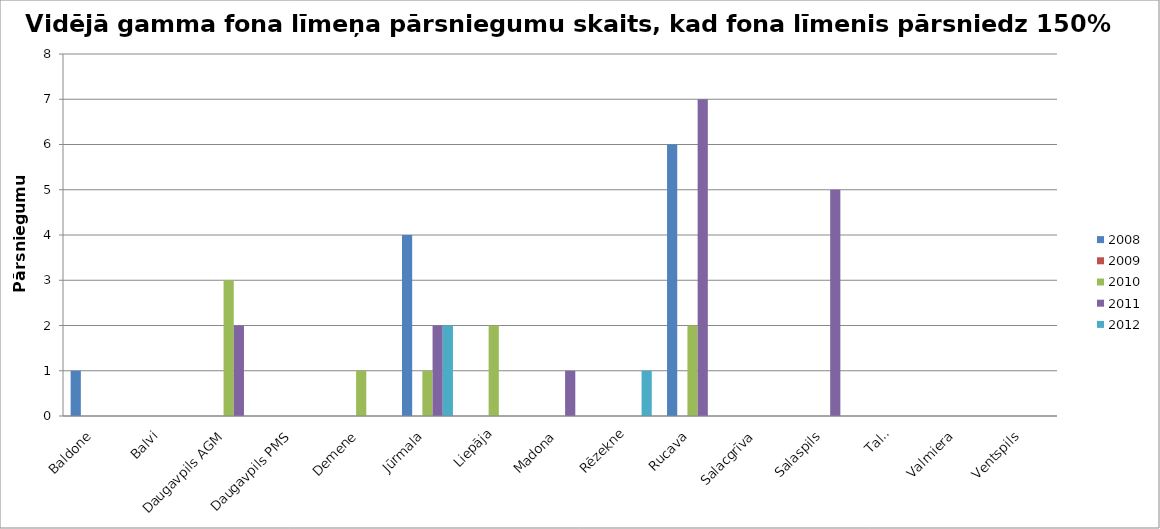
| Category | 2008 | 2009 | 2010 | 2011 | 2012 |
|---|---|---|---|---|---|
| Baldone | 1 | 0 | 0 | 0 | 0 |
| Balvi | 0 | 0 | 0 | 0 | 0 |
| Daugavpils AGM | 0 | 0 | 3 | 2 | 0 |
| Daugavpils PMS | 0 | 0 | 0 | 0 | 0 |
| Demene | 0 | 0 | 1 | 0 | 0 |
| Jūrmala | 4 | 0 | 1 | 2 | 2 |
| Liepāja | 0 | 0 | 2 | 0 | 0 |
| Madona | 0 | 0 | 0 | 1 | 0 |
| Rēzekne | 0 | 0 | 0 | 0 | 1 |
| Rucava | 6 | 0 | 2 | 7 | 0 |
| Salacgrīva | 0 | 0 | 0 | 0 | 0 |
| Salaspils | 0 | 0 | 0 | 5 | 0 |
| Talsi | 0 | 0 | 0 | 0 | 0 |
| Valmiera | 0 | 0 | 0 | 0 | 0 |
| Ventspils | 0 | 0 | 0 | 0 | 0 |